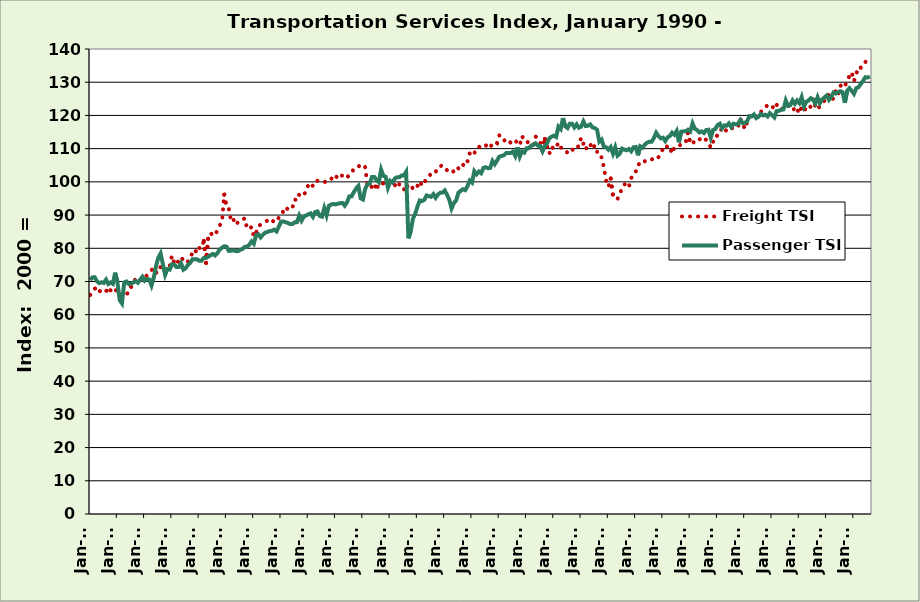
| Category | Freight TSI | Passenger TSI |
|---|---|---|
| 1990-01-01 | 65.968 | 70.454 |
| 1990-02-01 | 66.809 | 71.239 |
| 1990-03-01 | 67.818 | 71.292 |
| 1990-04-01 | 68.211 | 70.041 |
| 1990-05-01 | 66.906 | 69.524 |
| 1990-06-01 | 67.592 | 69.765 |
| 1990-07-01 | 67.156 | 69.568 |
| 1990-08-01 | 67 | 70.569 |
| 1990-09-01 | 68.318 | 69.245 |
| 1990-10-01 | 67.28 | 69.717 |
| 1990-11-01 | 66.83 | 69.297 |
| 1990-12-01 | 67.68 | 72.657 |
| 1991-01-01 | 66.847 | 69.851 |
| 1991-02-01 | 67.035 | 64.367 |
| 1991-03-01 | 66.274 | 63.406 |
| 1991-04-01 | 65.794 | 69.724 |
| 1991-05-01 | 65.555 | 70.011 |
| 1991-06-01 | 67.925 | 69.212 |
| 1991-07-01 | 68.323 | 69.386 |
| 1991-08-01 | 69.696 | 69.702 |
| 1991-09-01 | 70.752 | 70.143 |
| 1991-10-01 | 69.914 | 69.622 |
| 1991-11-01 | 70.488 | 70.539 |
| 1991-12-01 | 70.344 | 71.42 |
| 1992-01-01 | 71.153 | 70.226 |
| 1992-02-01 | 71.874 | 70.74 |
| 1992-03-01 | 72.593 | 70.625 |
| 1992-04-01 | 73.437 | 68.791 |
| 1992-05-01 | 73.914 | 71.134 |
| 1992-06-01 | 72.522 | 74.651 |
| 1992-07-01 | 74.364 | 77.194 |
| 1992-08-01 | 74.284 | 78.453 |
| 1992-09-01 | 72.832 | 75.22 |
| 1992-10-01 | 74.08 | 72.003 |
| 1992-11-01 | 74.601 | 73.74 |
| 1992-12-01 | 74.641 | 73.571 |
| 1993-01-01 | 77.776 | 75.193 |
| 1993-02-01 | 75.66 | 75.081 |
| 1993-03-01 | 74.984 | 74.363 |
| 1993-04-01 | 76.515 | 74.38 |
| 1993-05-01 | 77.39 | 75.48 |
| 1993-06-01 | 76.239 | 73.563 |
| 1993-07-01 | 76.65 | 73.992 |
| 1993-08-01 | 75.984 | 74.993 |
| 1993-09-01 | 76.893 | 75.589 |
| 1993-10-01 | 78.777 | 76.672 |
| 1993-11-01 | 79.654 | 76.726 |
| 1993-12-01 | 78.524 | 76.679 |
| 1994-01-01 | 80.062 | 76.252 |
| 1994-02-01 | 79.974 | 76.259 |
| 1994-03-01 | 82.181 | 77.111 |
| 1994-04-01 | 75.602 | 77.107 |
| 1994-05-01 | 83.546 | 77.487 |
| 1994-06-01 | 84.649 | 77.917 |
| 1994-07-01 | 83.742 | 78.292 |
| 1994-08-01 | 84.006 | 77.838 |
| 1994-09-01 | 85.448 | 78.56 |
| 1994-10-01 | 86.902 | 79.619 |
| 1994-11-01 | 87.94 | 80.184 |
| 1994-12-01 | 96.158 | 80.618 |
| 1995-01-01 | 92.468 | 80.478 |
| 1995-02-01 | 91.986 | 79.218 |
| 1995-03-01 | 88.165 | 79.244 |
| 1995-04-01 | 88.788 | 79.405 |
| 1995-05-01 | 87.053 | 79.161 |
| 1995-06-01 | 87.831 | 79.118 |
| 1995-07-01 | 87.882 | 79.524 |
| 1995-08-01 | 88.505 | 79.798 |
| 1995-09-01 | 89.047 | 80.423 |
| 1995-10-01 | 86.054 | 80.439 |
| 1995-11-01 | 85.739 | 81.046 |
| 1995-12-01 | 86.423 | 82.075 |
| 1996-01-01 | 83.529 | 81.373 |
| 1996-02-01 | 84.642 | 83.951 |
| 1996-03-01 | 86.792 | 84.223 |
| 1996-04-01 | 87.067 | 83.277 |
| 1996-05-01 | 87.547 | 84.083 |
| 1996-06-01 | 87.957 | 84.677 |
| 1996-07-01 | 88.337 | 84.932 |
| 1996-08-01 | 88.173 | 85.178 |
| 1996-09-01 | 87.626 | 85.264 |
| 1996-10-01 | 88.722 | 85.615 |
| 1996-11-01 | 89.5 | 85.094 |
| 1996-12-01 | 89.035 | 86.503 |
| 1997-01-01 | 89.792 | 88.023 |
| 1997-02-01 | 91.251 | 88.103 |
| 1997-03-01 | 90.741 | 87.837 |
| 1997-04-01 | 92.404 | 87.622 |
| 1997-05-01 | 92.661 | 87.278 |
| 1997-06-01 | 92.281 | 87.321 |
| 1997-07-01 | 94.737 | 87.829 |
| 1997-08-01 | 94.33 | 87.864 |
| 1997-09-01 | 96.244 | 89.842 |
| 1997-10-01 | 96.871 | 88.325 |
| 1997-11-01 | 96.277 | 89.481 |
| 1997-12-01 | 96.94 | 89.89 |
| 1998-01-01 | 99.256 | 90.239 |
| 1998-02-01 | 99.709 | 90.51 |
| 1998-03-01 | 98.701 | 89.468 |
| 1998-04-01 | 100.1 | 90.937 |
| 1998-05-01 | 100.333 | 91.088 |
| 1998-06-01 | 100.238 | 89.745 |
| 1998-07-01 | 100.326 | 89.517 |
| 1998-08-01 | 99.907 | 92.11 |
| 1998-09-01 | 100.179 | 89.903 |
| 1998-10-01 | 100.849 | 92.76 |
| 1998-11-01 | 101.134 | 93.159 |
| 1998-12-01 | 100.311 | 93.349 |
| 1999-01-01 | 100.932 | 93.218 |
| 1999-02-01 | 102.452 | 93.435 |
| 1999-03-01 | 101.959 | 93.577 |
| 1999-04-01 | 101.85 | 93.648 |
| 1999-05-01 | 102.24 | 92.835 |
| 1999-06-01 | 101.392 | 93.858 |
| 1999-07-01 | 101.957 | 95.625 |
| 1999-08-01 | 102.438 | 95.641 |
| 1999-09-01 | 104.109 | 96.913 |
| 1999-10-01 | 104.503 | 97.997 |
| 1999-11-01 | 104.616 | 98.782 |
| 1999-12-01 | 105.098 | 95.049 |
| 2000-01-01 | 105.3 | 94.7 |
| 2000-02-01 | 104.4 | 97.9 |
| 2000-03-01 | 99.2 | 99.3 |
| 2000-04-01 | 98.1 | 99.5 |
| 2000-05-01 | 98.6 | 101.5 |
| 2000-06-01 | 99.6 | 101.5 |
| 2000-07-01 | 97.4 | 100.5 |
| 2000-08-01 | 99.6 | 99.9 |
| 2000-09-01 | 99.6 | 103.7 |
| 2000-10-01 | 99.5 | 101.8 |
| 2000-11-01 | 99.8 | 101.5 |
| 2000-12-01 | 98.9 | 98.3 |
| 2001-01-01 | 99.5 | 100.3 |
| 2001-02-01 | 99.9 | 99.8 |
| 2001-03-01 | 99.1 | 101 |
| 2001-04-01 | 98.1 | 101.4 |
| 2001-05-01 | 99.3 | 101.4 |
| 2001-06-01 | 98.4 | 101.9 |
| 2001-07-01 | 97.6 | 101.9 |
| 2001-08-01 | 99.3 | 103 |
| 2001-09-01 | 98.1 | 83 |
| 2001-10-01 | 98.8 | 85 |
| 2001-11-01 | 98 | 88.9 |
| 2001-12-01 | 97.6 | 90.4 |
| 2002-01-01 | 98.8 | 92.6 |
| 2002-02-01 | 100.2 | 94.4 |
| 2002-03-01 | 98.8 | 94.2 |
| 2002-04-01 | 99.8 | 94.6 |
| 2002-05-01 | 100.9 | 95.9 |
| 2002-06-01 | 101.4 | 95.7 |
| 2002-07-01 | 102.7 | 95.5 |
| 2002-08-01 | 102.5 | 96.3 |
| 2002-09-01 | 103 | 95.2 |
| 2002-10-01 | 104.4 | 96.2 |
| 2002-11-01 | 104.7 | 96.7 |
| 2002-12-01 | 105 | 96.8 |
| 2003-01-01 | 104.1 | 97.4 |
| 2003-02-01 | 103.5 | 96.1 |
| 2003-03-01 | 103.6 | 94.6 |
| 2003-04-01 | 103.9 | 92 |
| 2003-05-01 | 102.9 | 93.6 |
| 2003-06-01 | 102.8 | 94.4 |
| 2003-07-01 | 104.1 | 96.7 |
| 2003-08-01 | 103.7 | 97.3 |
| 2003-09-01 | 104.9 | 97.8 |
| 2003-10-01 | 106.6 | 97.5 |
| 2003-11-01 | 106.2 | 98.7 |
| 2003-12-01 | 108.6 | 100.4 |
| 2004-01-01 | 107.8 | 99.8 |
| 2004-02-01 | 108.6 | 103.2 |
| 2004-03-01 | 110.2 | 102.3 |
| 2004-04-01 | 110.6 | 103.1 |
| 2004-05-01 | 110.3 | 102.6 |
| 2004-06-01 | 110.9 | 104.2 |
| 2004-07-01 | 111.1 | 104.4 |
| 2004-08-01 | 110 | 104.1 |
| 2004-09-01 | 110.6 | 104.2 |
| 2004-10-01 | 111.3 | 106.3 |
| 2004-11-01 | 112.1 | 105.3 |
| 2004-12-01 | 111.7 | 106.4 |
| 2005-01-01 | 114 | 107.6 |
| 2005-02-01 | 113.1 | 107.8 |
| 2005-03-01 | 112.3 | 108 |
| 2005-04-01 | 113 | 108.7 |
| 2005-05-01 | 112.3 | 108.7 |
| 2005-06-01 | 111.8 | 108.7 |
| 2005-07-01 | 111.8 | 109.1 |
| 2005-08-01 | 112.6 | 107.8 |
| 2005-09-01 | 111.5 | 110.4 |
| 2005-10-01 | 111 | 107.6 |
| 2005-11-01 | 113.8 | 109.2 |
| 2005-12-01 | 112.4 | 108.8 |
| 2006-01-01 | 112.4 | 110.1 |
| 2006-02-01 | 111.5 | 110.1 |
| 2006-03-01 | 112 | 110.9 |
| 2006-04-01 | 111.3 | 111.1 |
| 2006-05-01 | 113.6 | 111.6 |
| 2006-06-01 | 113.1 | 110.9 |
| 2006-07-01 | 111.9 | 110.8 |
| 2006-08-01 | 109.5 | 109.2 |
| 2006-09-01 | 112.9 | 110.8 |
| 2006-10-01 | 110.8 | 111.6 |
| 2006-11-01 | 108.5 | 113.1 |
| 2006-12-01 | 110.6 | 113.6 |
| 2007-01-01 | 109.8 | 113.9 |
| 2007-02-01 | 110.4 | 113.5 |
| 2007-03-01 | 111.8 | 116.6 |
| 2007-04-01 | 110.3 | 115.9 |
| 2007-05-01 | 110.3 | 119.2 |
| 2007-06-01 | 109.7 | 116.7 |
| 2007-07-01 | 108.7 | 116.2 |
| 2007-08-01 | 109.5 | 117.5 |
| 2007-09-01 | 109.3 | 117.5 |
| 2007-10-01 | 110.8 | 116.4 |
| 2007-11-01 | 110.6 | 117.3 |
| 2007-12-01 | 110.7 | 116.3 |
| 2008-01-01 | 113.3 | 116.6 |
| 2008-02-01 | 111.4 | 118.2 |
| 2008-03-01 | 109.7 | 116.8 |
| 2008-04-01 | 111.5 | 116.9 |
| 2008-05-01 | 111.3 | 117.3 |
| 2008-06-01 | 109.8 | 116.4 |
| 2008-07-01 | 111 | 116.2 |
| 2008-08-01 | 109.1 | 115.7 |
| 2008-09-01 | 107.4 | 112.1 |
| 2008-10-01 | 107.4 | 112.7 |
| 2008-11-01 | 104.3 | 110.6 |
| 2008-12-01 | 100.4 | 110.4 |
| 2009-01-01 | 98.5 | 109.7 |
| 2009-02-01 | 101 | 110.5 |
| 2009-03-01 | 95.8 | 108.5 |
| 2009-04-01 | 94.8 | 110.4 |
| 2009-05-01 | 94.9 | 107.9 |
| 2009-06-01 | 96.1 | 108.5 |
| 2009-07-01 | 98.4 | 110 |
| 2009-08-01 | 99.2 | 109.7 |
| 2009-09-01 | 99.6 | 109.5 |
| 2009-10-01 | 98.5 | 109.9 |
| 2009-11-01 | 101.2 | 109.2 |
| 2009-12-01 | 101.6 | 110.4 |
| 2010-01-01 | 103.1 | 110.5 |
| 2010-02-01 | 105.2 | 108 |
| 2010-03-01 | 105.5 | 110.7 |
| 2010-04-01 | 106.5 | 110.3 |
| 2010-05-01 | 106.2 | 111.2 |
| 2010-06-01 | 106.5 | 111.8 |
| 2010-07-01 | 106.9 | 112.1 |
| 2010-08-01 | 106.7 | 112.1 |
| 2010-09-01 | 107.2 | 113.2 |
| 2010-10-01 | 107.8 | 114.8 |
| 2010-11-01 | 107.4 | 113.8 |
| 2010-12-01 | 108.8 | 113.1 |
| 2011-01-01 | 109.9 | 113.3 |
| 2011-02-01 | 109.5 | 112.3 |
| 2011-03-01 | 111 | 113.4 |
| 2011-04-01 | 110.3 | 113.8 |
| 2011-05-01 | 108.5 | 114.8 |
| 2011-06-01 | 110.3 | 114.2 |
| 2011-07-01 | 110.3 | 115.3 |
| 2011-08-01 | 110.6 | 111.9 |
| 2011-09-01 | 111.5 | 115.1 |
| 2011-10-01 | 111.5 | 115.2 |
| 2011-11-01 | 111.9 | 115.2 |
| 2011-12-01 | 115 | 115.7 |
| 2012-01-01 | 111.5 | 115.2 |
| 2012-02-01 | 112.1 | 117.6 |
| 2012-03-01 | 111.7 | 116 |
| 2012-04-01 | 111.8 | 115.6 |
| 2012-05-01 | 112.7 | 114.9 |
| 2012-06-01 | 113.5 | 115.2 |
| 2012-07-01 | 113.3 | 114.7 |
| 2012-08-01 | 112.6 | 115.6 |
| 2012-09-01 | 112 | 115.7 |
| 2012-10-01 | 110.3 | 113.3 |
| 2012-11-01 | 112.1 | 115.6 |
| 2012-12-01 | 112.2 | 115.9 |
| 2013-01-01 | 114.4 | 117.1 |
| 2013-02-01 | 115.7 | 117.5 |
| 2013-03-01 | 115.7 | 116.1 |
| 2013-04-01 | 114.7 | 117 |
| 2013-05-01 | 115.8 | 116.9 |
| 2013-06-01 | 116.3 | 117.6 |
| 2013-07-01 | 115.9 | 116.5 |
| 2013-08-01 | 116.6 | 117.5 |
| 2013-09-01 | 116.6 | 117.3 |
| 2013-10-01 | 116.5 | 117.4 |
| 2013-11-01 | 119 | 118.6 |
| 2013-12-01 | 117.7 | 117.7 |
| 2014-01-01 | 115.9 | 117.8 |
| 2014-02-01 | 117.9 | 118.2 |
| 2014-03-01 | 119.5 | 119.8 |
| 2014-04-01 | 120 | 119.7 |
| 2014-05-01 | 120.5 | 120.3 |
| 2014-06-01 | 119.5 | 119.2 |
| 2014-07-01 | 120.4 | 119.6 |
| 2014-08-01 | 121.1 | 120.4 |
| 2014-09-01 | 121.4 | 120 |
| 2014-10-01 | 122.2 | 120.2 |
| 2014-11-01 | 123.3 | 119.7 |
| 2014-12-01 | 122.9 | 120.7 |
| 2015-01-01 | 122.8 | 120.1 |
| 2015-02-01 | 121.8 | 119.4 |
| 2015-03-01 | 123.2 | 121.3 |
| 2015-04-01 | 122.1 | 121.4 |
| 2015-05-01 | 122.3 | 121.7 |
| 2015-06-01 | 121.7 | 121.8 |
| 2015-07-01 | 122.6 | 124.5 |
| 2015-08-01 | 122.9 | 122.9 |
| 2015-09-01 | 122.7 | 123.1 |
| 2015-10-01 | 122.9 | 124.5 |
| 2015-11-01 | 121 | 123.5 |
| 2015-12-01 | 120.7 | 124.5 |
| 2016-01-01 | 122.8 | 123.7 |
| 2016-02-01 | 121.6 | 125.5 |
| 2016-03-01 | 120.9 | 122.7 |
| 2016-04-01 | 122.6 | 124.1 |
| 2016-05-01 | 122.1 | 124.5 |
| 2016-06-01 | 122.7 | 125.2 |
| 2016-07-01 | 125.1 | 124.7 |
| 2016-08-01 | 122.7 | 123.6 |
| 2016-09-01 | 121.7 | 125.5 |
| 2016-10-01 | 122.9 | 123.7 |
| 2016-11-01 | 123.7 | 124.8 |
| 2016-12-01 | 124.4 | 125.4 |
| 2017-01-01 | 124.6 | 126 |
| 2017-02-01 | 126.3 | 124.7 |
| 2017-03-01 | 124.8 | 125.6 |
| 2017-04-01 | 125.1 | 126.9 |
| 2017-05-01 | 127.4 | 126.6 |
| 2017-06-01 | 126 | 127 |
| 2017-07-01 | 128.9 | 127.3 |
| 2017-08-01 | 129.3 | 127 |
| 2017-09-01 | 128.6 | 123.8 |
| 2017-10-01 | 130.7 | 127.4 |
| 2017-11-01 | 131.8 | 128.2 |
| 2017-12-01 | 133 | 127.4 |
| 2018-01-01 | 130.3 | 126.5 |
| 2018-02-01 | 132.5 | 128.2 |
| 2018-03-01 | 134.6 | 128.5 |
| 2018-04-01 | 134.4 | 129.5 |
| 2018-05-01 | 135.7 | 130.4 |
| 2018-06-01 | 136.2 | 131.5 |
| 2018-07-01 | 135.2 | 131.4 |
| 2018-08-01 | 135.3 | 131.7 |